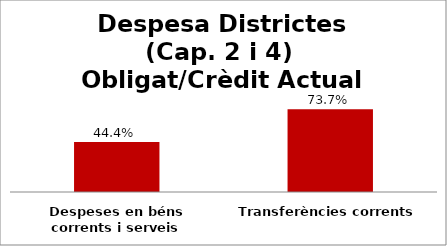
| Category | Series 0 |
|---|---|
| Despeses en béns corrents i serveis | 0.444 |
| Transferències corrents | 0.737 |